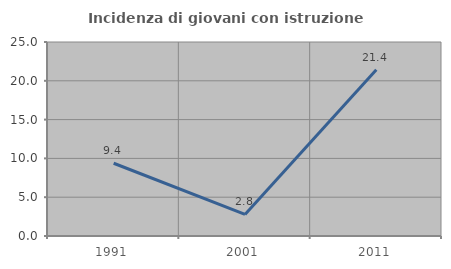
| Category | Incidenza di giovani con istruzione universitaria |
|---|---|
| 1991.0 | 9.375 |
| 2001.0 | 2.778 |
| 2011.0 | 21.429 |